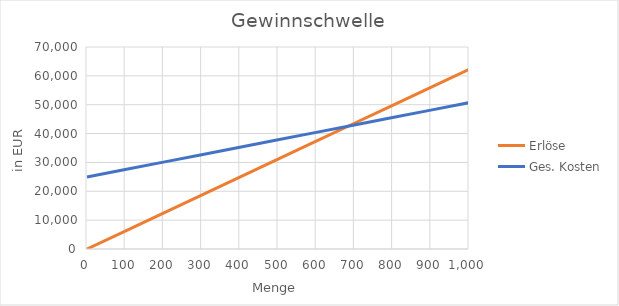
| Category | Erlöse | Ges. Kosten |
|---|---|---|
| 0.0 | 0 | 24958 |
| 100.0 | 6225 | 27533 |
| 200.0 | 12450 | 30108 |
| 300.0 | 18675 | 32683 |
| 400.0 | 24900 | 35258 |
| 500.0 | 31125 | 37833 |
| 600.0 | 37350 | 40408 |
| 700.0 | 43575 | 42983 |
| 800.0 | 49800 | 45558 |
| 900.0 | 56025 | 48133 |
| 1000.0 | 62250 | 50708 |